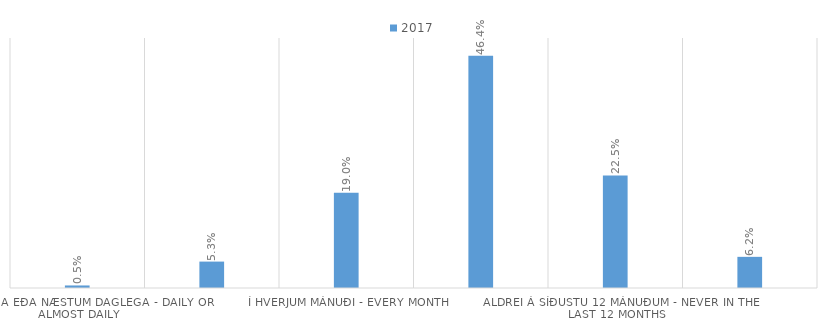
| Category | 2017 |
|---|---|
| Daglega eða næstum daglega - Daily or almost daily | 0.005 |
| Í hverri viku - Every week | 0.053 |
| Í hverjum mánuði - Every month | 0.19 |
| Sjaldnar en einu sinni í mánuði - Less than once a month | 0.464 |
| Aldrei á síðustu 12 mánuðum - Never in the last 12 months | 0.225 |
| Aldrei drukkið áfengi - Never consumed alcohol | 0.062 |